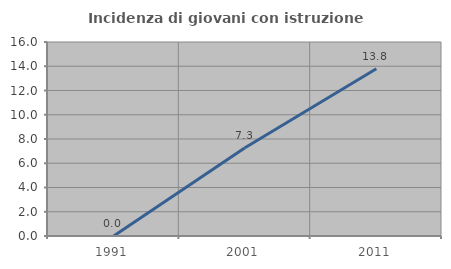
| Category | Incidenza di giovani con istruzione universitaria |
|---|---|
| 1991.0 | 0 |
| 2001.0 | 7.273 |
| 2011.0 | 13.793 |